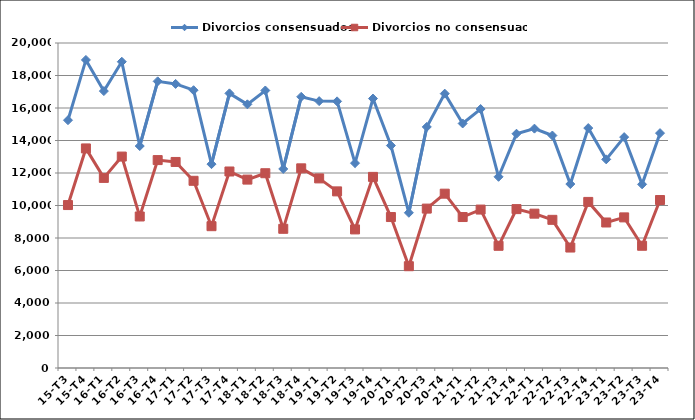
| Category | Divorcios consensuados | Divorcios no consensuados |
|---|---|---|
| 15-T3 | 15249 | 10027 |
| 15-T4 | 18958 | 13512 |
| 16-T1 | 17041 | 11699 |
| 16-T2 | 18847 | 13011 |
| 16-T3 | 13660 | 9325 |
| 16-T4 | 17641 | 12795 |
| 17-T1 | 17483 | 12679 |
| 17-T2 | 17095 | 11520 |
| 17-T3 | 12545 | 8727 |
| 17-T4 | 16901 | 12093 |
| 18-T1 | 16226 | 11594 |
| 18-T2 | 17077 | 11986 |
| 18-T3 | 12249 | 8566 |
| 18-T4 | 16689 | 12287 |
| 19-T1 | 16423 | 11668 |
| 19-T2 | 16409 | 10869 |
| 19-T3 | 12607 | 8528 |
| 19-T4 | 16581 | 11761 |
| 20-T1 | 13690 | 9290 |
| 20-T2 | 9552 | 6264 |
| 20-T3 | 14835 | 9809 |
| 20-T4 | 16883 | 10727 |
| 21-T1 | 15048 | 9290 |
| 21-T2 | 15937 | 9750 |
| 21-T3 | 11767 | 7520 |
| 21-T4 | 14416 | 9777 |
| 22-T1 | 14730 | 9498 |
| 22-T2 | 14306 | 9118 |
| 22-T3 | 11321 | 7413 |
| 22-T4 | 14766 | 10221 |
| 23-T1 | 12839 | 8954 |
| 23-T2 | 14208 | 9269 |
| 23-T3 | 11303 | 7522 |
| 23-T4 | 14453 | 10337 |